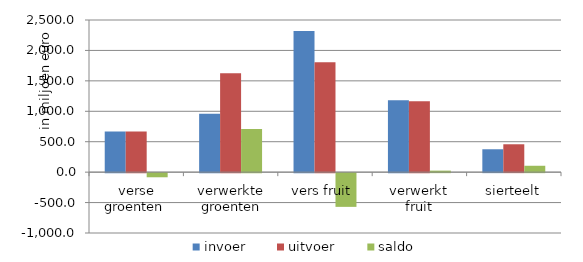
| Category | invoer | uitvoer | saldo |
|---|---|---|---|
| verse groenten  | 666.253 | 669.223 | -67.82 |
| verwerkte groenten | 959.538 | 1626.094 | 709.444 |
| vers fruit  | 2318.081 | 1804.44 | -554.106 |
| verwerkt fruit | 1180.539 | 1164.268 | 24.918 |
| sierteelt | 375.963 | 458.037 | 104.867 |